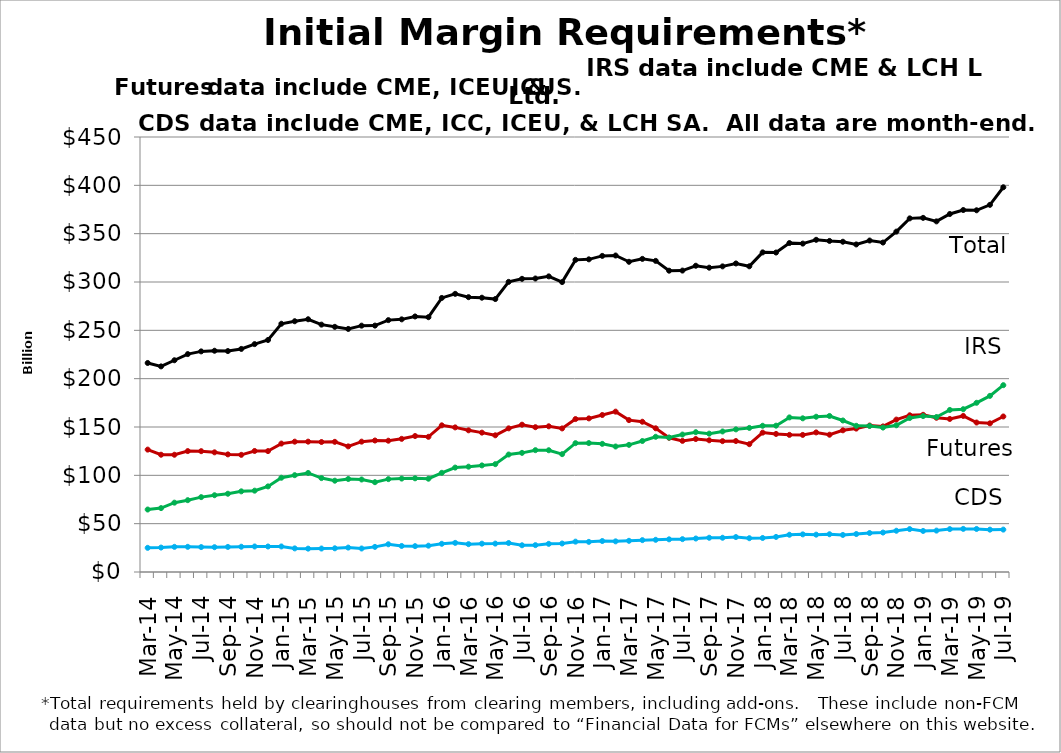
| Category | CDS | Futures | IRS | Total |
|---|---|---|---|---|
| Mar-14 |  |  |  |  |
|   |  |  |  |  |
| May-14 |  |  |  |  |
|    |  |  |  |  |
| Jul-14 |  |  |  |  |
|   |  |  |  |  |
| Sep-14 |  |  |  |  |
|   |  |  |  |  |
| Nov-14 |  |  |  |  |
|   |  |  |  |  |
| Jan-15 |  |  |  |  |
|   |  |  |  |  |
| Mar-15 |  |  |  |  |
|   |  |  |  |  |
| May-15 |  |  |  |  |
|   |  |  |  |  |
| Jul-15 |  |  |  |  |
|   |  |  |  |  |
| Sep-15 |  |  |  |  |
|   |  |  |  |  |
| Nov-15 |  |  |  |  |
|   |  |  |  |  |
| Jan-16 |  |  |  |  |
|   |  |  |  |  |
| Mar-16 |  |  |  |  |
|   |  |  |  |  |
| May-16 |  |  |  |  |
|   |  |  |  |  |
| Jul-16 |  |  |  |  |
|   |  |  |  |  |
| Sep-16 |  |  |  |  |
|   |  |  |  |  |
| Nov-16 |  |  |  |  |
|   |  |  |  |  |
| Jan-17 |  |  |  |  |
|   |  |  |  |  |
| Mar-17 |  |  |  |  |
|   |  |  |  |  |
| May-17 |  |  |  |  |
|   |  |  |  |  |
| Jul-17 |  |  |  |  |
|   |  |  |  |  |
| Sep-17 |  |  |  |  |
|   |  |  |  |  |
| Nov-17 |  |  |  |  |
|   |  |  |  |  |
| Jan-18 |  |  |  |  |
|   |  |  |  |  |
| Mar-18 |  |  |  |  |
|   |  |  |  |  |
| May-18 |  |  |  |  |
|   |  |  |  |  |
| Jul-18 |  |  |  |  |
|   |  |  |  |  |
| Sep-18 |  |  |  |  |
|   |  |  |  |  |
| Nov-18 |  |  |  |  |
|   |  |  |  |  |
| Jan-19 |  |  |  |  |
|   |  |  |  |  |
| Mar-19 |  |  |  |  |
|   |  |  |  |  |
| May-19 |  |  |  |  |
|   |  |  |  |  |
| Jul-19 |  |  |  |  |